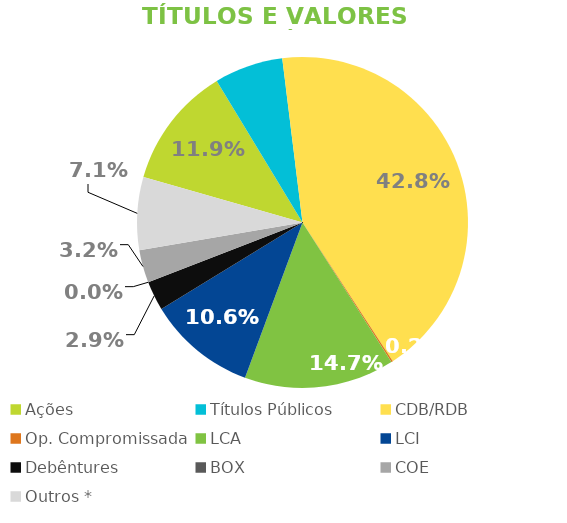
| Category | TVM |
|---|---|
| Ações | 0.119 |
| Títulos Públicos | 0.067 |
| CDB/RDB | 0.428 |
| Op. Compromissada | 0.002 |
| LCA | 0.147 |
| LCI | 0.106 |
| Debêntures | 0.029 |
| BOX | 0 |
| COE | 0.032 |
| Outros * | 0.071 |